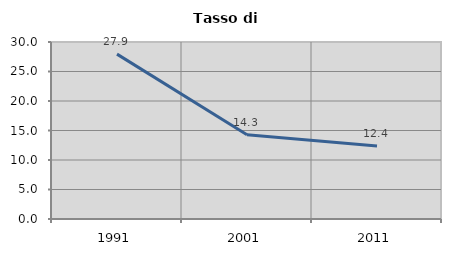
| Category | Tasso di disoccupazione   |
|---|---|
| 1991.0 | 27.943 |
| 2001.0 | 14.286 |
| 2011.0 | 12.355 |